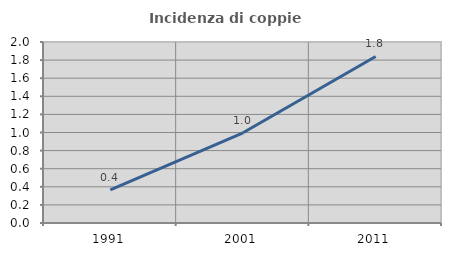
| Category | Incidenza di coppie miste |
|---|---|
| 1991.0 | 0.366 |
| 2001.0 | 0.997 |
| 2011.0 | 1.84 |